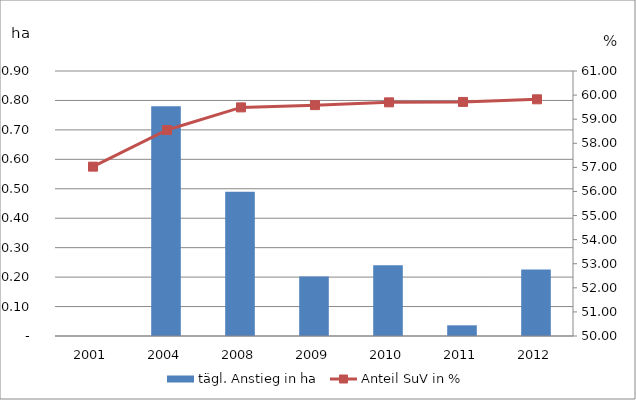
| Category | tägl. Anstieg in ha |
|---|---|
| 2001 | 0 |
| 2004 | 0.78 |
| 2008 | 0.49 |
| 2009 | 0.202 |
| 2010 | 0.24 |
| 2011 | 0.036 |
| 2012 | 0.226 |